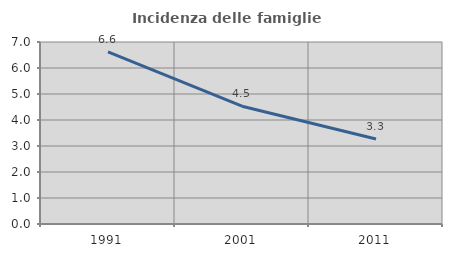
| Category | Incidenza delle famiglie numerose |
|---|---|
| 1991.0 | 6.624 |
| 2001.0 | 4.531 |
| 2011.0 | 3.269 |